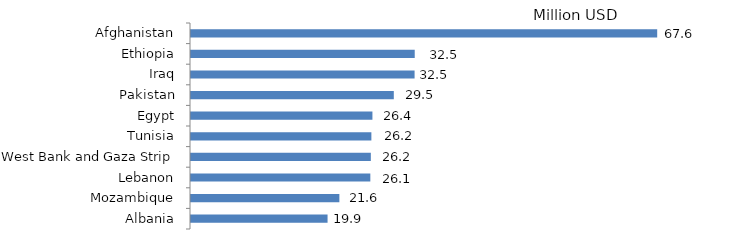
| Category | Series 0 |
|---|---|
| Afghanistan | 67.586 |
| Ethiopia | 32.51 |
| Iraq | 32.49 |
| Pakistan | 29.483 |
| Egypt | 26.39 |
| Tunisia | 26.239 |
| West Bank and Gaza Strip | 26.16 |
| Lebanon | 26.088 |
| Mozambique | 21.609 |
| Albania | 19.9 |